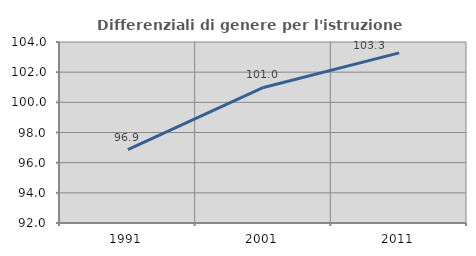
| Category | Differenziali di genere per l'istruzione superiore |
|---|---|
| 1991.0 | 96.869 |
| 2001.0 | 100.985 |
| 2011.0 | 103.278 |